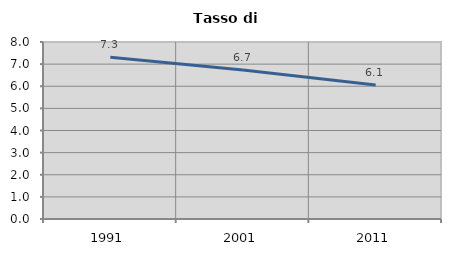
| Category | Tasso di disoccupazione   |
|---|---|
| 1991.0 | 7.311 |
| 2001.0 | 6.733 |
| 2011.0 | 6.061 |